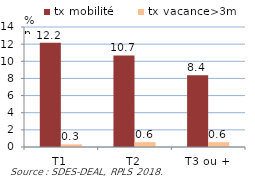
| Category | tx mobilité | tx vacance>3m |
|---|---|---|
| T1 | 12.158 | 0.311 |
| T2 | 10.683 | 0.567 |
| T3 ou + | 8.379 | 0.568 |